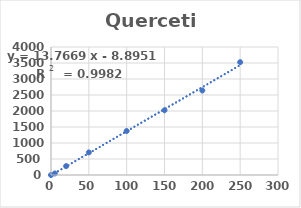
| Category | Series 0 |
|---|---|
| 0.0 | 0 |
| 5.0 | 48.551 |
| 20.0 | 278.241 |
| 50.0 | 705.53 |
| 100.0 | 1375.049 |
| 150.0 | 2023.347 |
| 200.0 | 2641.086 |
| 250.0 | 3526.412 |